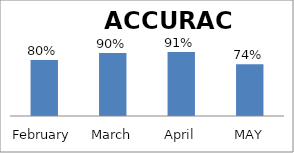
| Category | ACCURACY |
|---|---|
| February | 0.8 |
| March | 0.9 |
| April | 0.913 |
| MAY | 0.74 |